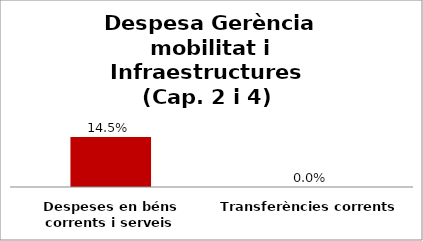
| Category | Series 0 |
|---|---|
| Despeses en béns corrents i serveis | 0.145 |
| Transferències corrents | 0 |